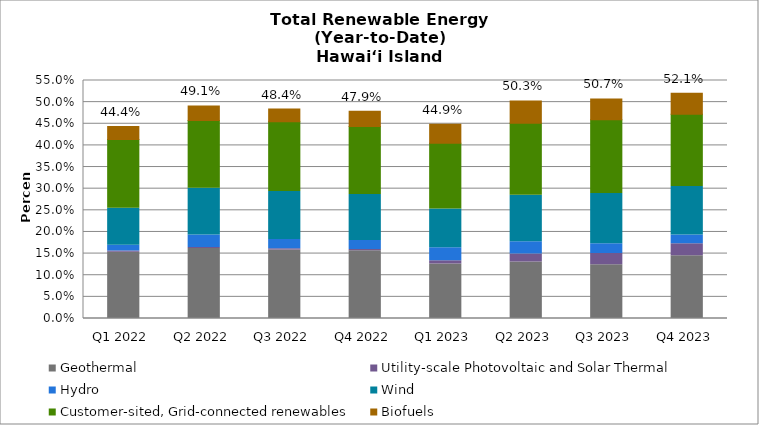
| Category | Geothermal | Utility-scale Photovoltaic and Solar Thermal | Hydro | Wind | Customer-sited, Grid-connected renewables | Biofuels |
|---|---|---|---|---|---|---|
| Q1 2022 | 0.153 | 0.003 | 0.014 | 0.085 | 0.159 | 0.03 |
| Q2 2022 | 0.162 | 0.003 | 0.028 | 0.108 | 0.157 | 0.033 |
| Q3 2022 | 0.158 | 0.003 | 0.021 | 0.111 | 0.161 | 0.029 |
| Q4 2022 | 0.157 | 0.003 | 0.021 | 0.106 | 0.158 | 0.035 |
| Q1 2023 | 0.126 | 0.008 | 0.03 | 0.09 | 0.152 | 0.044 |
| Q2 2023 | 0.13 | 0.019 | 0.029 | 0.107 | 0.166 | 0.051 |
| Q3 2023 | 0.124 | 0.026 | 0.023 | 0.116 | 0.17 | 0.048 |
| Q4 2023 | 0.145 | 0.028 | 0.02 | 0.113 | 0.167 | 0.049 |